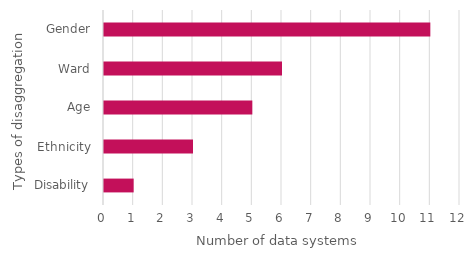
| Category | Number of data systems |
|---|---|
| Disability | 1 |
| Ethnicity | 3 |
| Age | 5 |
| Ward | 6 |
| Gender | 11 |